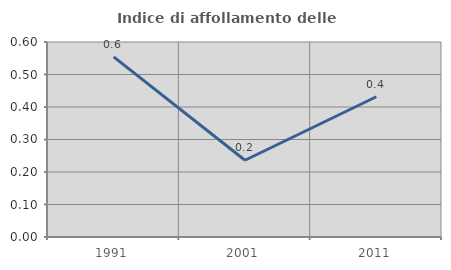
| Category | Indice di affollamento delle abitazioni  |
|---|---|
| 1991.0 | 0.554 |
| 2001.0 | 0.236 |
| 2011.0 | 0.431 |